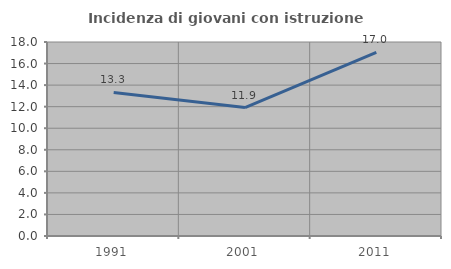
| Category | Incidenza di giovani con istruzione universitaria |
|---|---|
| 1991.0 | 13.316 |
| 2001.0 | 11.917 |
| 2011.0 | 17.035 |